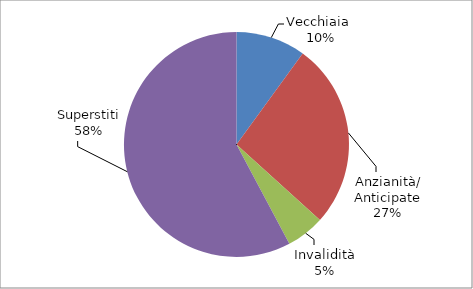
| Category | Series 0 |
|---|---|
| Vecchiaia  | 3234 |
| Anzianità/ Anticipate | 8618 |
| Invalidità | 1779 |
| Superstiti | 18657 |